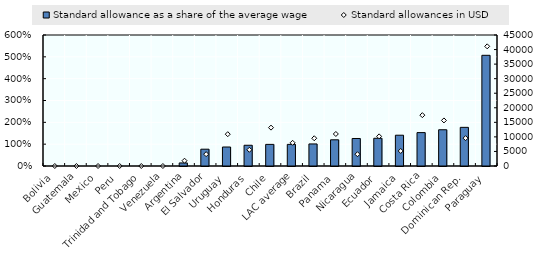
| Category | Standard allowance as a share of the average wage |
|---|---|
| Bolivia | 0 |
| Guatemala | 0 |
| Mexico | 0 |
| Peru | 0 |
| Trinidad and Tobago | 0 |
| Venezuela | 0 |
| Argentina | 0.14 |
| El Salvador | 0.77 |
| Uruguay | 0.87 |
| Honduras | 0.95 |
| Chile | 0.99 |
| LAC average | 0.99 |
| Brazil | 1.01 |
| Panama | 1.2 |
| Nicaragua | 1.26 |
| Ecuador | 1.27 |
| Jamaica | 1.41 |
| Costa Rica | 1.53 |
| Colombia | 1.66 |
| Dominican Rep. | 1.77 |
| Paraguay | 5.07 |